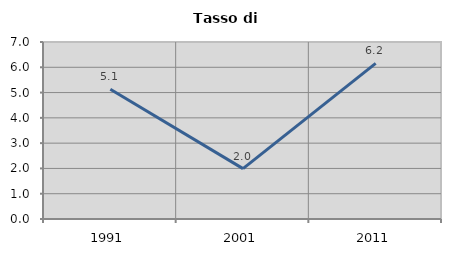
| Category | Tasso di disoccupazione   |
|---|---|
| 1991.0 | 5.131 |
| 2001.0 | 1.992 |
| 2011.0 | 6.154 |